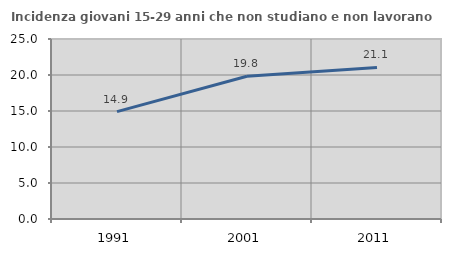
| Category | Incidenza giovani 15-29 anni che non studiano e non lavorano  |
|---|---|
| 1991.0 | 14.92 |
| 2001.0 | 19.82 |
| 2011.0 | 21.053 |